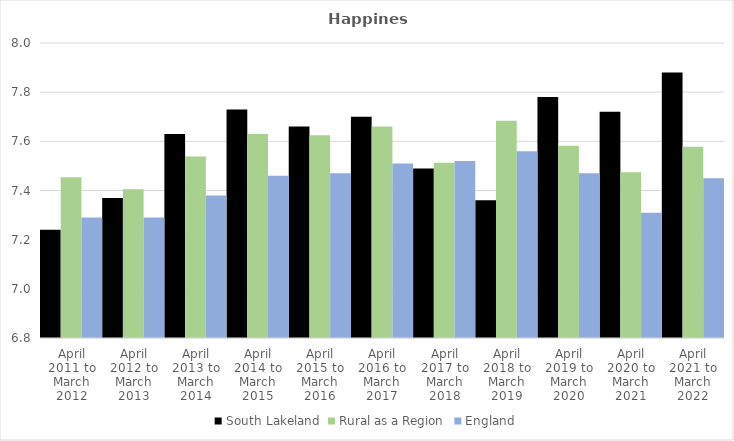
| Category | South Lakeland | Rural as a Region | England |
|---|---|---|---|
| April 2011 to March 2012 | 7.24 | 7.454 | 7.29 |
| April 2012 to March 2013 | 7.37 | 7.406 | 7.29 |
| April 2013 to March 2014 | 7.63 | 7.539 | 7.38 |
| April 2014 to March 2015 | 7.73 | 7.63 | 7.46 |
| April 2015 to March 2016 | 7.66 | 7.625 | 7.47 |
| April 2016 to March 2017 | 7.7 | 7.661 | 7.51 |
| April 2017 to March 2018 | 7.49 | 7.513 | 7.52 |
| April 2018 to March 2019 | 7.36 | 7.684 | 7.56 |
| April 2019 to March 2020 | 7.78 | 7.582 | 7.47 |
| April 2020 to March 2021 | 7.72 | 7.474 | 7.31 |
| April 2021 to March 2022 | 7.88 | 7.577 | 7.45 |